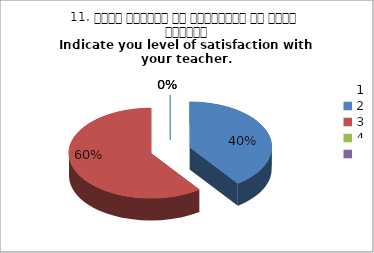
| Category | 11. अपने शिक्षक से संतुष्टि का स्तर बताइये
Indicate you level of satisfaction with your teacher.
 |
|---|---|
| 0 | 2 |
| 1 | 3 |
| 2 | 0 |
| 3 | 0 |
| 4 | 0 |